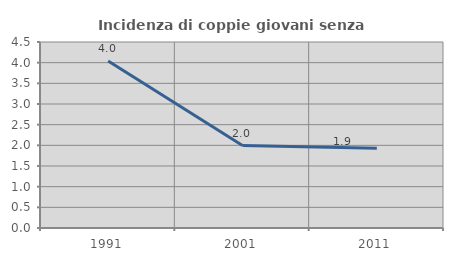
| Category | Incidenza di coppie giovani senza figli |
|---|---|
| 1991.0 | 4.039 |
| 2001.0 | 1.995 |
| 2011.0 | 1.927 |